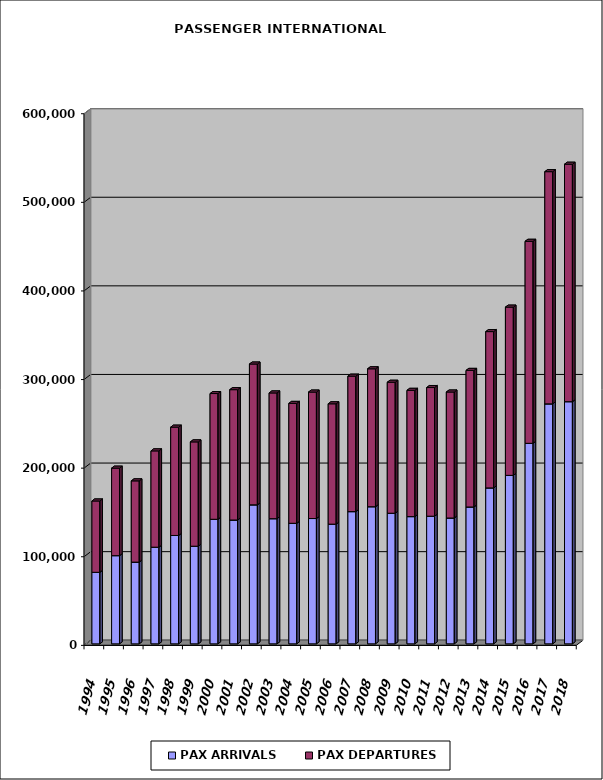
| Category | PAX ARRIVALS | PAX DEPARTURES |
|---|---|---|
| 1994.0 | 80734 | 80495 |
| 1995.0 | 99550 | 98750 |
| 1996.0 | 92225 | 91708 |
| 1997.0 | 109088 | 108686 |
| 1998.0 | 122303 | 122258 |
| 1999.0 | 110199 | 117733 |
| 2000.0 | 140592 | 141890 |
| 2001.0 | 139773 | 147084 |
| 2002.0 | 156879 | 158912 |
| 2003.0 | 141254 | 141908 |
| 2004.0 | 136061 | 135301 |
| 2005.0 | 141440 | 142712 |
| 2006.0 | 135083 | 135818 |
| 2007.0 | 149231 | 152857 |
| 2008.0 | 154765 | 155639 |
| 2009.0 | 147402 | 147831 |
| 2010.0 | 143597 | 142508 |
| 2011.0 | 144058 | 145207 |
| 2012.0 | 142027 | 142179 |
| 2013.0 | 154489 | 154118 |
| 2014.0 | 175986 | 176398 |
| 2015.0 | 190129 | 189882 |
| 2016.0 | 226308 | 227992 |
| 2017.0 | 270825 | 262054 |
| 2018.0 | 273307 | 267976 |